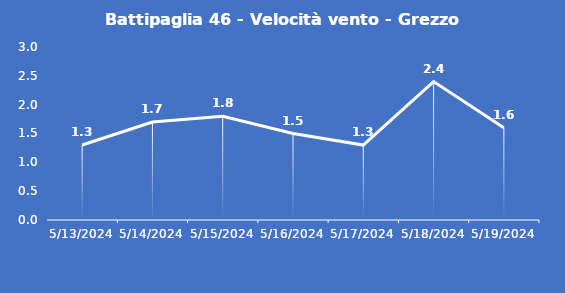
| Category | Battipaglia 46 - Velocità vento - Grezzo (m/s) |
|---|---|
| 5/13/24 | 1.3 |
| 5/14/24 | 1.7 |
| 5/15/24 | 1.8 |
| 5/16/24 | 1.5 |
| 5/17/24 | 1.3 |
| 5/18/24 | 2.4 |
| 5/19/24 | 1.6 |